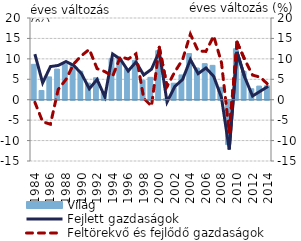
| Category | Világ |
|---|---|
| 1984.0 | 8.656 |
| 1985.0 | 2.258 |
| 1986.0 | 5.585 |
| 1987.0 | 7.497 |
| 1988.0 | 8.695 |
| 1989.0 | 8.462 |
| 1990.0 | 6.997 |
| 1991.0 | 4.067 |
| 1992.0 | 5.371 |
| 1993.0 | 1.816 |
| 1994.0 | 10.128 |
| 1995.0 | 10.026 |
| 1996.0 | 7.603 |
| 1997.0 | 9.621 |
| 1998.0 | 4.763 |
| 1999.0 | 5.479 |
| 2000.0 | 11.991 |
| 2001.0 | 0.242 |
| 2002.0 | 4.041 |
| 2003.0 | 6.066 |
| 2004.0 | 11.289 |
| 2005.0 | 7.759 |
| 2006.0 | 8.834 |
| 2007.0 | 8.408 |
| 2008.0 | 3.04 |
| 2009.0 | -10.856 |
| 2010.0 | 12.48 |
| 2011.0 | 6.936 |
| 2012.0 | 2.686 |
| 2013.0 | 3.33 |
| 2014.0 | 3.43 |